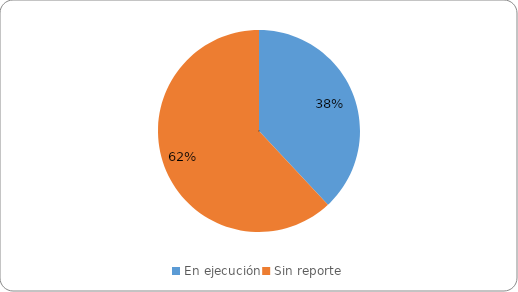
| Category | Series 0 |
|---|---|
| En ejecución | 105 |
| Sin reporte | 171 |